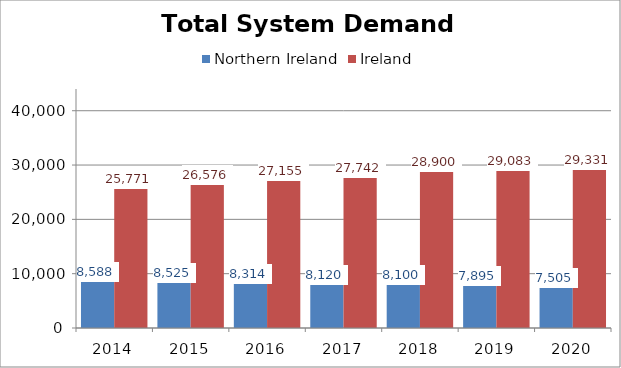
| Category | Northern Ireland | Ireland |
|---|---|---|
| 2014.0 | 8587.891 | 25770.691 |
| 2015.0 | 8524.897 | 26575.624 |
| 2016.0 | 8314.402 | 27155.16 |
| 2017.0 | 8119.954 | 27742.043 |
| 2018.0 | 8100.479 | 28900.084 |
| 2019.0 | 7895.444 | 29082.882 |
| 2020.0 | 7504.855 | 29330.523 |